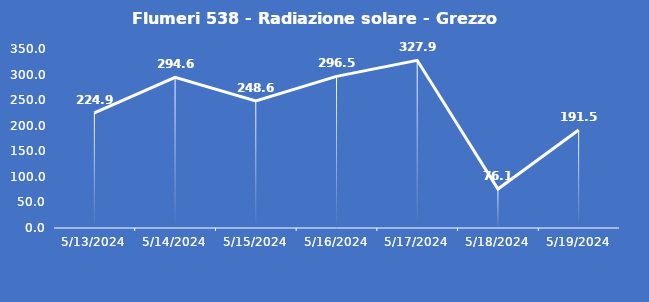
| Category | Flumeri 538 - Radiazione solare - Grezzo (W/m2) |
|---|---|
| 5/13/24 | 224.9 |
| 5/14/24 | 294.6 |
| 5/15/24 | 248.6 |
| 5/16/24 | 296.5 |
| 5/17/24 | 327.9 |
| 5/18/24 | 76.1 |
| 5/19/24 | 191.5 |